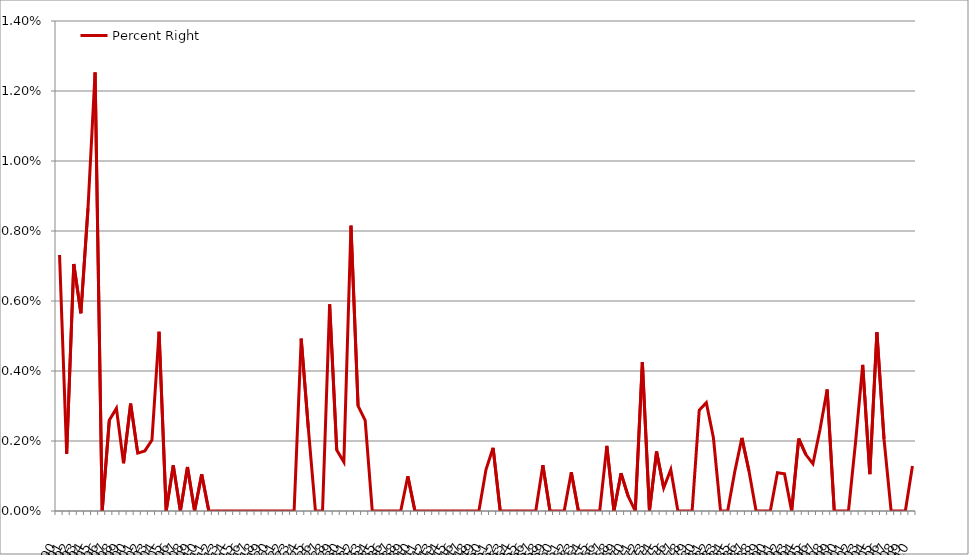
| Category | Percent Right |
|---|---|
| 1890.0 | 0.007 |
| 1891.0 | 0.002 |
| 1892.0 | 0.007 |
| 1893.0 | 0.006 |
| 1894.0 | 0.009 |
| 1895.0 | 0.013 |
| 1896.0 | 0 |
| 1897.0 | 0.003 |
| 1898.0 | 0.003 |
| 1899.0 | 0.001 |
| 1900.0 | 0.003 |
| 1901.0 | 0.002 |
| 1902.0 | 0.002 |
| 1903.0 | 0.002 |
| 1904.0 | 0.005 |
| 1905.0 | 0 |
| 1906.0 | 0.001 |
| 1907.0 | 0 |
| 1908.0 | 0.001 |
| 1909.0 | 0 |
| 1910.0 | 0.001 |
| 1911.0 | 0 |
| 1912.0 | 0 |
| 1913.0 | 0 |
| 1914.0 | 0 |
| 1915.0 | 0 |
| 1916.0 | 0 |
| 1917.0 | 0 |
| 1918.0 | 0 |
| 1919.0 | 0 |
| 1920.0 | 0 |
| 1921.0 | 0 |
| 1922.0 | 0 |
| 1923.0 | 0 |
| 1924.0 | 0.005 |
| 1925.0 | 0.002 |
| 1926.0 | 0 |
| 1927.0 | 0 |
| 1928.0 | 0.006 |
| 1929.0 | 0.002 |
| 1930.0 | 0.001 |
| 1931.0 | 0.008 |
| 1932.0 | 0.003 |
| 1933.0 | 0.003 |
| 1934.0 | 0 |
| 1935.0 | 0 |
| 1936.0 | 0 |
| 1937.0 | 0 |
| 1938.0 | 0 |
| 1939.0 | 0.001 |
| 1940.0 | 0 |
| 1941.0 | 0 |
| 1942.0 | 0 |
| 1943.0 | 0 |
| 1944.0 | 0 |
| 1945.0 | 0 |
| 1946.0 | 0 |
| 1947.0 | 0 |
| 1948.0 | 0 |
| 1949.0 | 0 |
| 1950.0 | 0.001 |
| 1951.0 | 0.002 |
| 1952.0 | 0 |
| 1953.0 | 0 |
| 1954.0 | 0 |
| 1955.0 | 0 |
| 1956.0 | 0 |
| 1957.0 | 0 |
| 1958.0 | 0.001 |
| 1959.0 | 0 |
| 1960.0 | 0 |
| 1961.0 | 0 |
| 1962.0 | 0.001 |
| 1963.0 | 0 |
| 1964.0 | 0 |
| 1965.0 | 0 |
| 1966.0 | 0 |
| 1967.0 | 0.002 |
| 1968.0 | 0 |
| 1969.0 | 0.001 |
| 1970.0 | 0 |
| 1971.0 | 0 |
| 1972.0 | 0.004 |
| 1973.0 | 0 |
| 1974.0 | 0.002 |
| 1975.0 | 0.001 |
| 1976.0 | 0.001 |
| 1977.0 | 0 |
| 1978.0 | 0 |
| 1979.0 | 0 |
| 1980.0 | 0.003 |
| 1981.0 | 0.003 |
| 1982.0 | 0.002 |
| 1983.0 | 0 |
| 1984.0 | 0 |
| 1985.0 | 0.001 |
| 1986.0 | 0.002 |
| 1987.0 | 0.001 |
| 1988.0 | 0 |
| 1989.0 | 0 |
| 1990.0 | 0 |
| 1991.0 | 0.001 |
| 1992.0 | 0.001 |
| 1993.0 | 0 |
| 1994.0 | 0.002 |
| 1995.0 | 0.002 |
| 1996.0 | 0.001 |
| 1997.0 | 0.002 |
| 1998.0 | 0.003 |
| 1999.0 | 0 |
| 2000.0 | 0 |
| 2001.0 | 0 |
| 2002.0 | 0.002 |
| 2003.0 | 0.004 |
| 2004.0 | 0.001 |
| 2005.0 | 0.005 |
| 2006.0 | 0.002 |
| 2007.0 | 0 |
| 2008.0 | 0 |
| 2009.0 | 0 |
| 2010.0 | 0.001 |